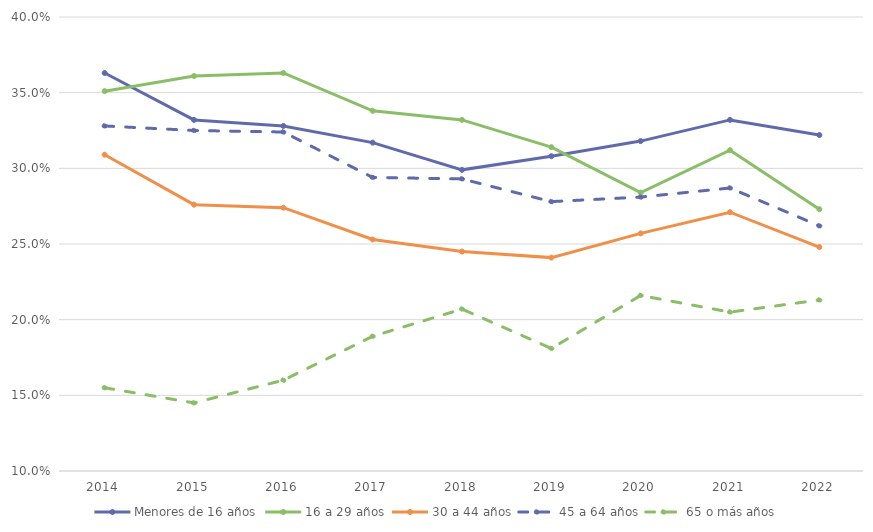
| Category | Menores de 16 años | 16 a 29 años | 30 a 44 años | 45 a 64 años | 65 o más años |
|---|---|---|---|---|---|
| 2014.0 | 0.363 | 0.351 | 0.309 | 0.328 | 0.155 |
| 2015.0 | 0.332 | 0.361 | 0.276 | 0.325 | 0.145 |
| 2016.0 | 0.328 | 0.363 | 0.274 | 0.324 | 0.16 |
| 2017.0 | 0.317 | 0.338 | 0.253 | 0.294 | 0.189 |
| 2018.0 | 0.299 | 0.332 | 0.245 | 0.293 | 0.207 |
| 2019.0 | 0.308 | 0.314 | 0.241 | 0.278 | 0.181 |
| 2020.0 | 0.318 | 0.284 | 0.257 | 0.281 | 0.216 |
| 2021.0 | 0.332 | 0.312 | 0.271 | 0.287 | 0.205 |
| 2022.0 | 0.322 | 0.273 | 0.248 | 0.262 | 0.213 |